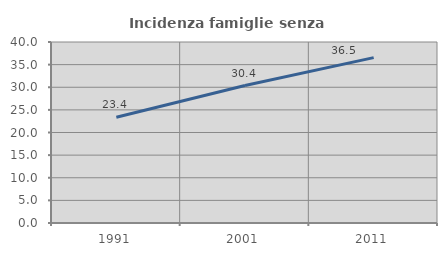
| Category | Incidenza famiglie senza nuclei |
|---|---|
| 1991.0 | 23.382 |
| 2001.0 | 30.378 |
| 2011.0 | 36.547 |